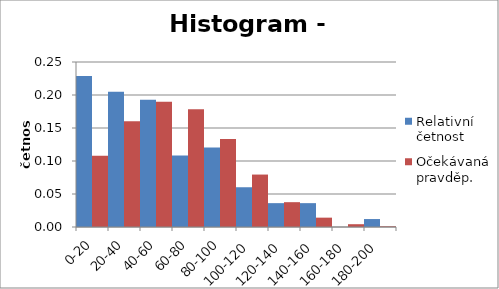
| Category | Relativní četnost | Očekávaná pravděp. |
|---|---|---|
| 0-20 | 0.229 | 0.108 |
| 20-40 | 0.205 | 0.16 |
| 40-60 | 0.193 | 0.19 |
| 60-80 | 0.108 | 0.178 |
| 80-100 | 0.12 | 0.133 |
| 100-120 | 0.06 | 0.079 |
| 120-140 | 0.036 | 0.038 |
| 140-160 | 0.036 | 0.014 |
| 160-180 | 0 | 0.004 |
| 180-200 | 0.012 | 0.001 |